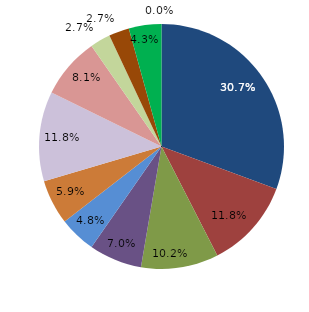
| Category | Series 0 |
|---|---|
| قبل الدخول | 30.645 |
| -1 | 11.828 |
| 1 | 10.215 |
| 2 | 6.989 |
| 3 | 4.839 |
| 4 | 5.914 |
|  5 - 9 | 11.828 |
|  10 - 14 | 8.065 |
|  15 - 19 | 2.688 |
|  20 - 24 | 2.688 |
| 25 + | 4.301 |
| غير مبين | 0 |